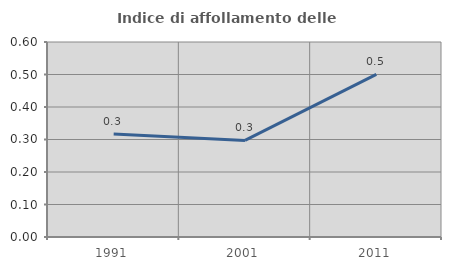
| Category | Indice di affollamento delle abitazioni  |
|---|---|
| 1991.0 | 0.317 |
| 2001.0 | 0.297 |
| 2011.0 | 0.5 |